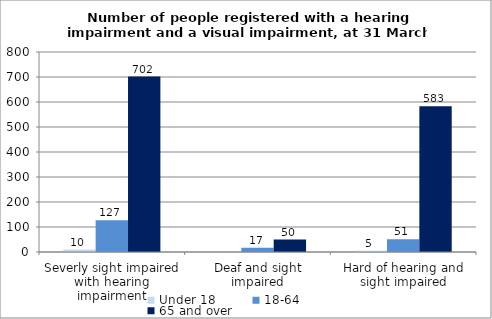
| Category | Under 18 | 18-64 | 65 and over |
|---|---|---|---|
| Severly sight impaired with hearing impairment | 10 | 127 | 702 |
| Deaf and sight impaired | 0 | 17 | 50 |
| Hard of hearing and sight impaired | 5 | 51 | 583 |